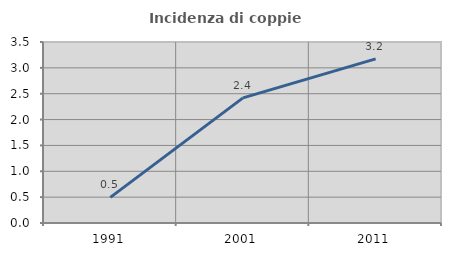
| Category | Incidenza di coppie miste |
|---|---|
| 1991.0 | 0.496 |
| 2001.0 | 2.42 |
| 2011.0 | 3.175 |